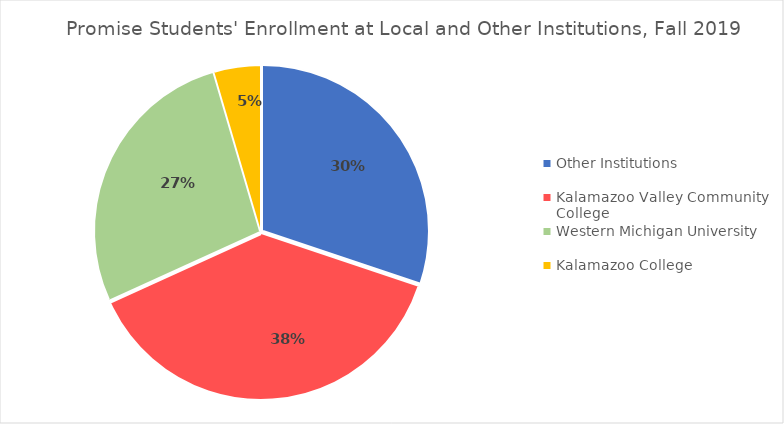
| Category | Series 1 |
|---|---|
| Other Institutions | 0.301 |
| Kalamazoo Valley Community College | 0.381 |
| Western Michigan University | 0.273 |
| Kalamazoo College | 0.045 |